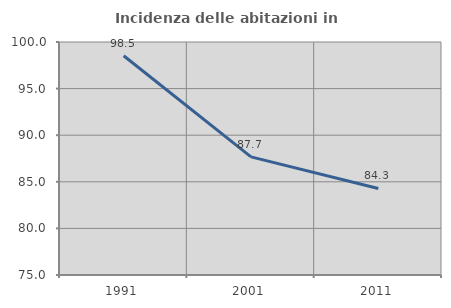
| Category | Incidenza delle abitazioni in proprietà  |
|---|---|
| 1991.0 | 98.529 |
| 2001.0 | 87.671 |
| 2011.0 | 84.286 |